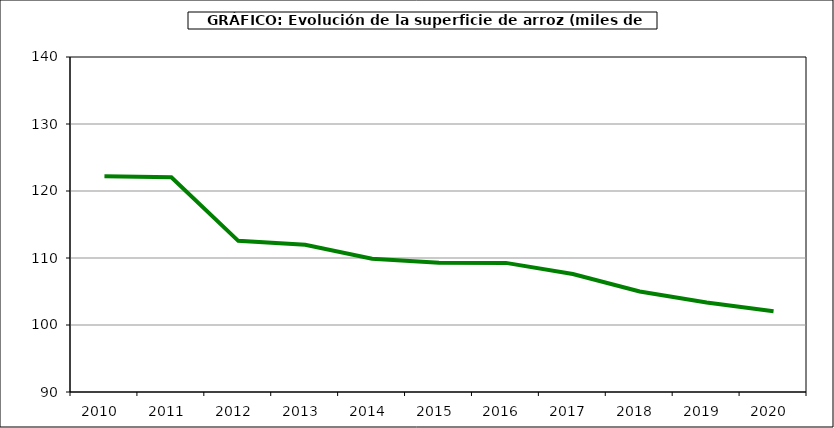
| Category | Superficie |
|---|---|
| 2010.0 | 122.184 |
| 2011.0 | 122.058 |
| 2012.0 | 112.557 |
| 2013.0 | 111.984 |
| 2014.0 | 109.889 |
| 2015.0 | 109.29 |
| 2016.0 | 109.272 |
| 2017.0 | 107.604 |
| 2018.0 | 105.012 |
| 2019.0 | 103.367 |
| 2020.0 | 102.064 |